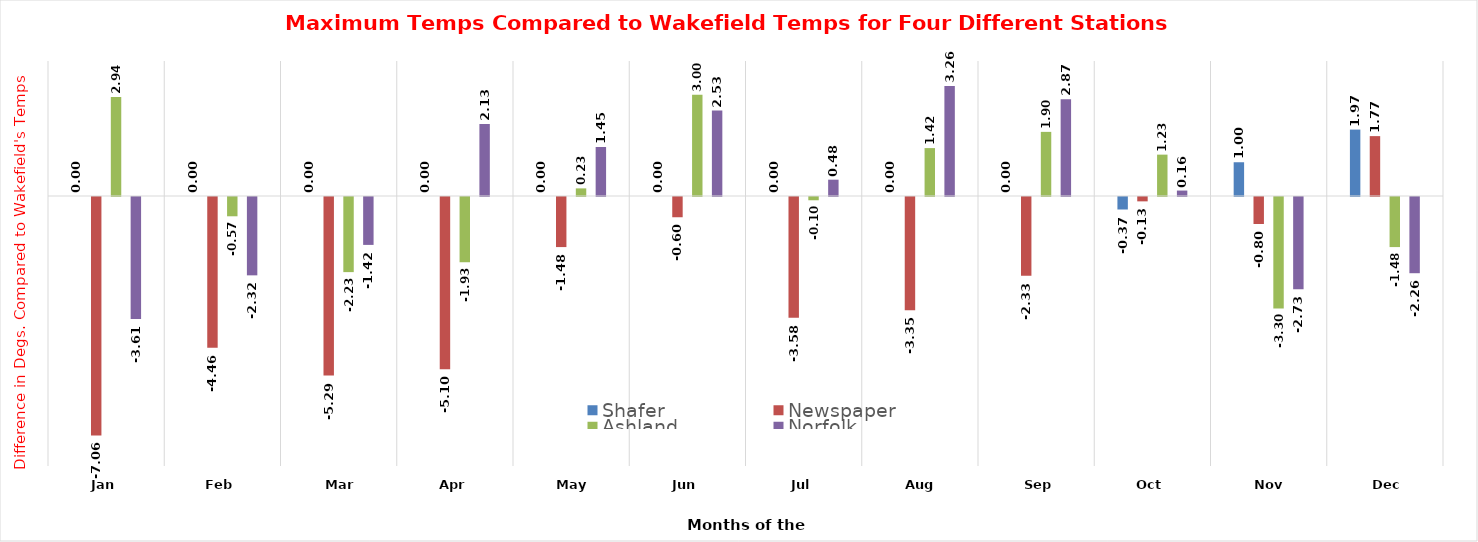
| Category | Shafer | Newspaper | Ashland   | Norfolk |
|---|---|---|---|---|
| Jan | 0 | -7.065 | 2.935 | -3.613 |
| Feb | 0 | -4.464 | -0.571 | -2.321 |
| Mar | 0 | -5.29 | -2.226 | -1.419 |
| Apr | 0 | -5.1 | -1.933 | 2.133 |
| May | 0 | -1.484 | 0.226 | 1.452 |
| Jun | 0 | -0.6 | 3 | 2.533 |
| Jul | 0 | -3.581 | -0.097 | 0.484 |
| Aug | 0 | -3.355 | 1.419 | 3.258 |
| Sep | 0 | -2.333 | 1.9 | 2.867 |
| Oct | -0.37 | -0.129 | 1.226 | 0.161 |
| Nov | 1 | -0.8 | -3.3 | -2.733 |
| Dec | 1.968 | 1.774 | -1.484 | -2.258 |